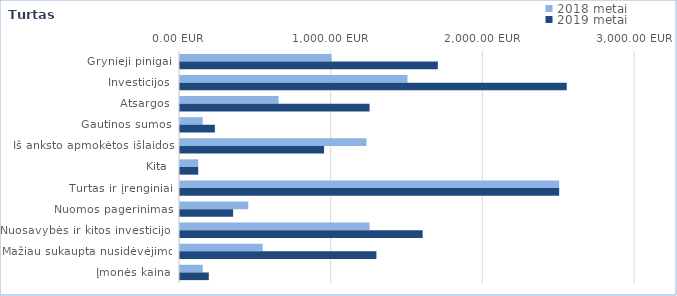
| Category | 2018 metai  | 2019 metai  |
|---|---|---|
| Grynieji pinigai | 1000 | 1700 |
| Investicijos | 1500 | 2550 |
| Atsargos | 650 | 1250 |
| Gautinos sumos | 150 | 230 |
| Iš anksto apmokėtos išlaidos | 1230 | 950 |
| Kita | 120 | 120 |
| Turtas ir įrenginiai | 2500 | 2500 |
| Nuomos pagerinimas | 450 | 350 |
| Nuosavybės ir kitos investicijos | 1250 | 1600 |
| Mažiau sukaupta nusidėvėjimo | 545 | 1295 |
| Įmonės kaina | 150 | 190 |